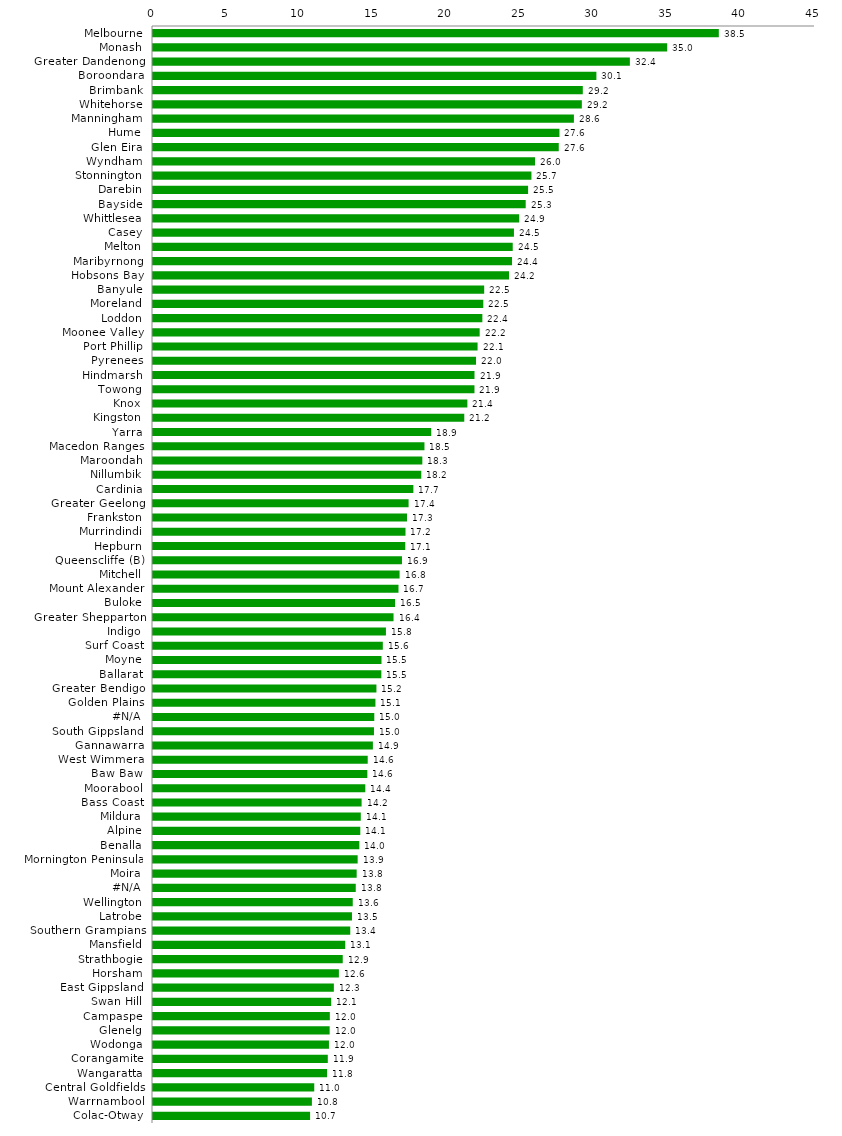
| Category | Series 0 |
|---|---|
| Melbourne | 38.462 |
| Monash | 34.951 |
| Greater Dandenong | 32.415 |
| Boroondara | 30.14 |
| Brimbank | 29.216 |
| Whitehorse | 29.151 |
| Manningham | 28.612 |
| Hume | 27.628 |
| Glen Eira | 27.582 |
| Wyndham | 25.97 |
| Stonnington | 25.724 |
| Darebin | 25.498 |
| Bayside | 25.334 |
| Whittlesea | 24.893 |
| Casey | 24.535 |
| Melton | 24.453 |
| Maribyrnong | 24.406 |
| Hobsons Bay | 24.201 |
| Banyule | 22.513 |
| Moreland | 22.452 |
| Loddon | 22.388 |
| Moonee Valley | 22.205 |
| Port Phillip | 22.063 |
| Pyrenees | 21.959 |
| Hindmarsh | 21.855 |
| Towong | 21.853 |
| Knox | 21.369 |
| Kingston | 21.159 |
| Yarra | 18.913 |
| Macedon Ranges | 18.453 |
| Maroondah | 18.308 |
| Nillumbik | 18.235 |
| Cardinia | 17.699 |
| Greater Geelong | 17.374 |
| Frankston | 17.266 |
| Murrindindi | 17.164 |
| Hepburn | 17.148 |
| Queenscliffe (B) | 16.924 |
| Mitchell | 16.761 |
| Mount Alexander | 16.688 |
| Buloke | 16.456 |
| Greater Shepparton | 16.351 |
| Indigo | 15.834 |
| Surf Coast | 15.621 |
| Moyne | 15.532 |
| Ballarat | 15.522 |
| Greater Bendigo | 15.188 |
| Golden Plains | 15.12 |
| #N/A | 15.042 |
| South Gippsland | 15.021 |
| Gannawarra | 14.948 |
| West Wimmera | 14.595 |
| Baw Baw | 14.57 |
| Moorabool | 14.431 |
| Bass Coast | 14.18 |
| Mildura | 14.125 |
| Alpine | 14.091 |
| Benalla | 14.025 |
| Mornington Peninsula | 13.912 |
| Moira | 13.845 |
| #N/A | 13.782 |
| Wellington | 13.578 |
| Latrobe | 13.526 |
| Southern Grampians | 13.409 |
| Mansfield | 13.067 |
| Strathbogie | 12.897 |
| Horsham | 12.636 |
| East Gippsland | 12.294 |
| Swan Hill | 12.111 |
| Campaspe | 12.02 |
| Glenelg | 12.008 |
| Wodonga | 11.961 |
| Corangamite | 11.882 |
| Wangaratta | 11.834 |
| Central Goldfields | 10.961 |
| Warrnambool | 10.801 |
| Colac-Otway | 10.679 |